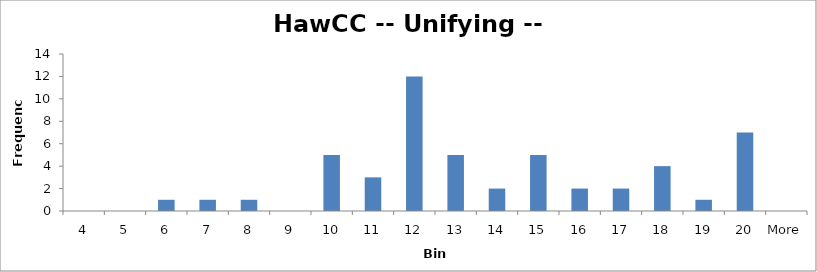
| Category | Frequency |
|---|---|
| 4 | 0 |
| 5 | 0 |
| 6 | 1 |
| 7 | 1 |
| 8 | 1 |
| 9 | 0 |
| 10 | 5 |
| 11 | 3 |
| 12 | 12 |
| 13 | 5 |
| 14 | 2 |
| 15 | 5 |
| 16 | 2 |
| 17 | 2 |
| 18 | 4 |
| 19 | 1 |
| 20 | 7 |
| More | 0 |